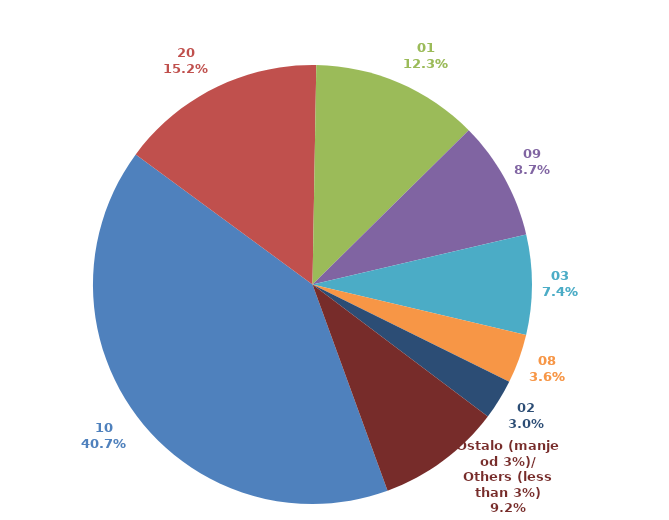
| Category | Series 0 |
|---|---|
| 10 | 0.407 |
| 20 | 0.152 |
| 01 | 0.123 |
| 09 | 0.087 |
| 03 | 0.074 |
| 08 | 0.036 |
| 02 | 0.03 |
| Ostalo (manje od 3%)/
Others (less than 3%) | 0.092 |